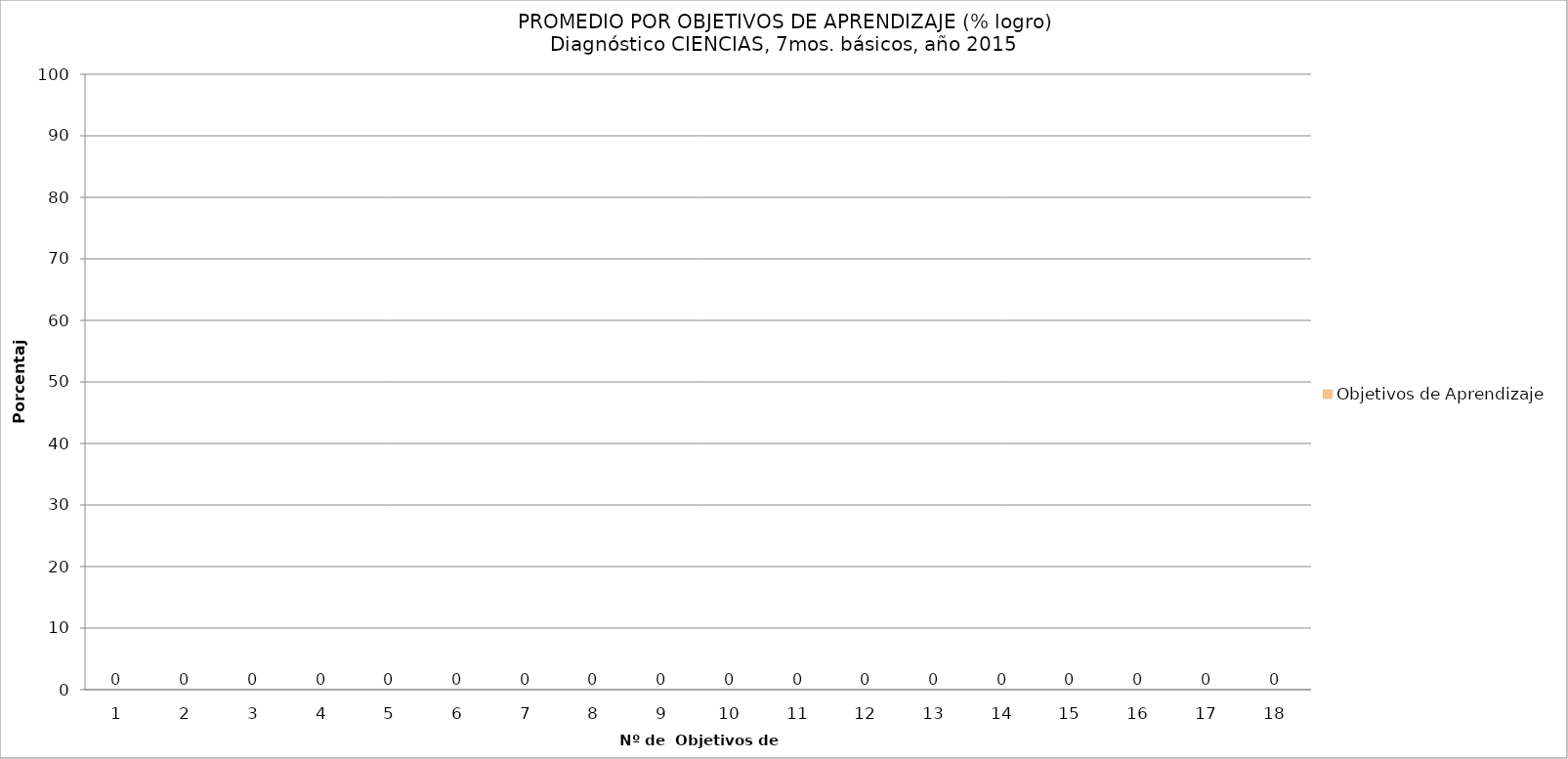
| Category | Objetivos de Aprendizaje |
|---|---|
| 0 | 0 |
| 1 | 0 |
| 2 | 0 |
| 3 | 0 |
| 4 | 0 |
| 5 | 0 |
| 6 | 0 |
| 7 | 0 |
| 8 | 0 |
| 9 | 0 |
| 10 | 0 |
| 11 | 0 |
| 12 | 0 |
| 13 | 0 |
| 14 | 0 |
| 15 | 0 |
| 16 | 0 |
| 17 | 0 |